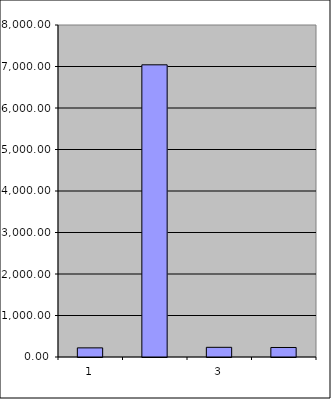
| Category | Series 0 |
|---|---|
| 0 | 220 |
| 1 | 7040.45 |
| 2 | 233.258 |
| 3 | 229.187 |